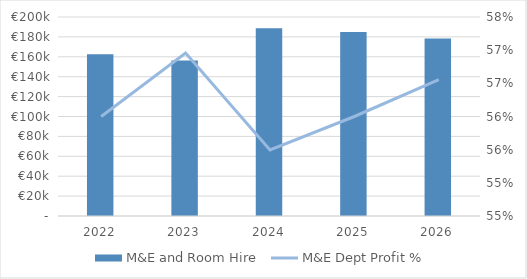
| Category | M&E and Room Hire |
|---|---|
| 2022.0 | 162500 |
| 2023.0 | 156400 |
| 2024.0 | 188640 |
| 2025.0 | 185000 |
| 2026.0 | 178500 |